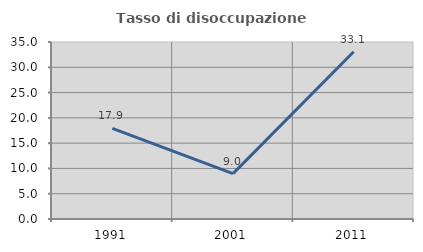
| Category | Tasso di disoccupazione giovanile  |
|---|---|
| 1991.0 | 17.925 |
| 2001.0 | 8.964 |
| 2011.0 | 33.083 |